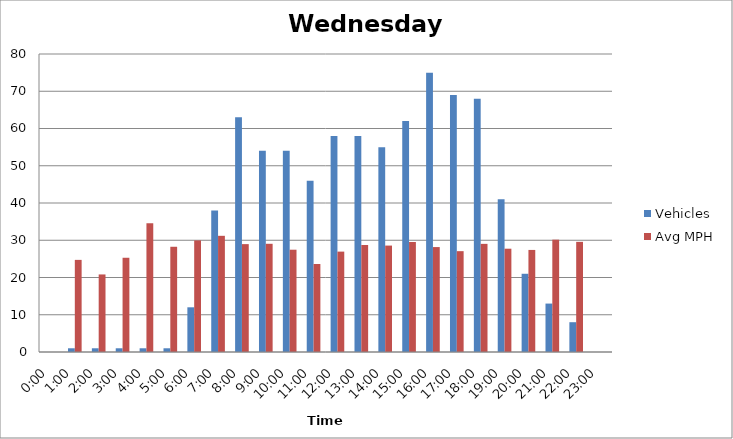
| Category | Vehicles | Avg MPH |
|---|---|---|
| 0:00 | 0 | 0 |
| 1:00 | 1 | 24.73 |
| 2:00 | 1 | 20.82 |
| 3:00 | 1 | 25.3 |
| 4:00 | 1 | 34.57 |
| 5:00 | 1 | 28.25 |
| 6:00 | 12 | 29.96 |
| 7:00 | 38 | 31.19 |
| 8:00 | 63 | 28.96 |
| 9:00 | 54 | 29.05 |
| 10:00 | 54 | 27.46 |
| 11:00 | 46 | 23.62 |
| 12:00 | 58 | 26.95 |
| 13:00 | 58 | 28.73 |
| 14:00 | 55 | 28.57 |
| 15:00 | 62 | 29.53 |
| 16:00 | 75 | 28.17 |
| 17:00 | 69 | 27.07 |
| 18:00 | 68 | 29.03 |
| 19:00 | 41 | 27.73 |
| 20:00 | 21 | 27.4 |
| 21:00 | 13 | 30.16 |
| 22:00 | 8 | 29.57 |
| 23:00 | 0 | 0 |